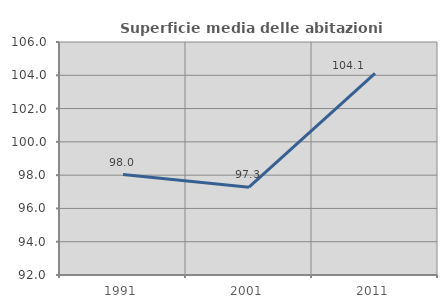
| Category | Superficie media delle abitazioni occupate |
|---|---|
| 1991.0 | 98.038 |
| 2001.0 | 97.275 |
| 2011.0 | 104.112 |